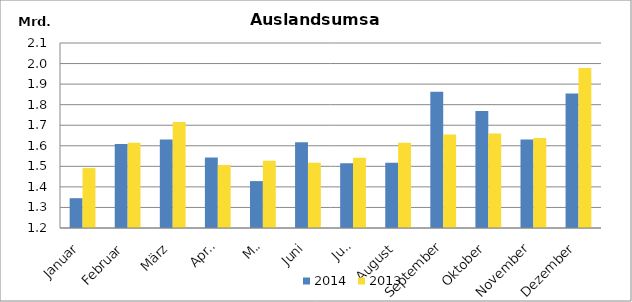
| Category | 2014 | 2013 |
|---|---|---|
| Januar | 1345047.319 | 1491402.703 |
| Februar | 1608376.527 | 1614333.452 |
| März | 1630183.896 | 1716194.544 |
| April | 1543397.975 | 1506580.741 |
| Mai | 1428183.258 | 1527197.147 |
| Juni | 1617458.524 | 1517890.016 |
| Juli | 1515118.999 | 1541611 |
| August | 1517187.882 | 1614744.826 |
| September | 1863078.479 | 1654999.288 |
| Oktober | 1768818.579 | 1659908.386 |
| November | 1630861.854 | 1637950.709 |
| Dezember | 1853867.927 | 1978181.752 |